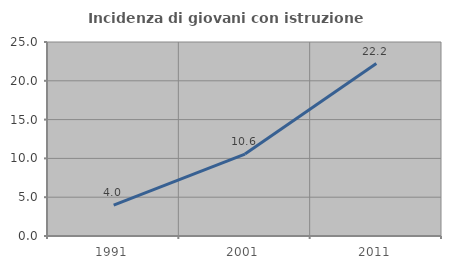
| Category | Incidenza di giovani con istruzione universitaria |
|---|---|
| 1991.0 | 3.98 |
| 2001.0 | 10.561 |
| 2011.0 | 22.222 |